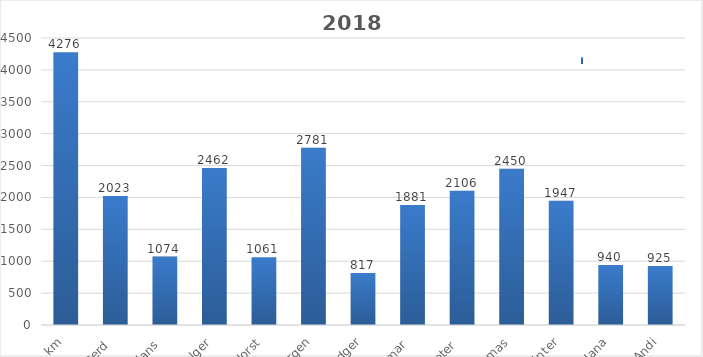
| Category | Series 0 |
|---|---|
| km | 4276 |
| Gerd  | 2023 |
| Hans  | 1074 |
| Holger | 2462 |
| Horst | 1061 |
| Jürgen | 2781 |
| Ludger | 817 |
| Ottmar  | 1881 |
| Peter  | 2106 |
| Thomas | 2450 |
| Günter | 1947 |
| Jana | 940 |
| Andi | 925 |